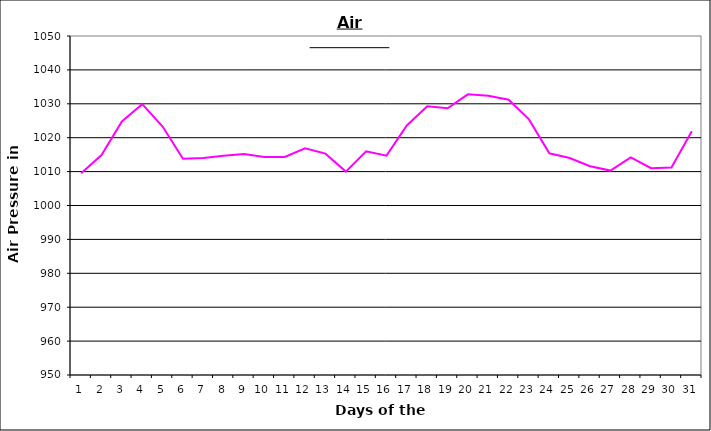
| Category | Series 0 |
|---|---|
| 0 | 1009.5 |
| 1 | 1014.9 |
| 2 | 1024.8 |
| 3 | 1029.9 |
| 4 | 1023.3 |
| 5 | 1013.8 |
| 6 | 1014 |
| 7 | 1014.7 |
| 8 | 1015.2 |
| 9 | 1014.3 |
| 10 | 1014.3 |
| 11 | 1016.9 |
| 12 | 1015.3 |
| 13 | 1010 |
| 14 | 1016 |
| 15 | 1014.7 |
| 16 | 1023.6 |
| 17 | 1029.3 |
| 18 | 1028.7 |
| 19 | 1032.8 |
| 20 | 1032.4 |
| 21 | 1031.2 |
| 22 | 1025.4 |
| 23 | 1015.4 |
| 24 | 1014 |
| 25 | 1011.6 |
| 26 | 1010.3 |
| 27 | 1014.2 |
| 28 | 1011 |
| 29 | 1011.2 |
| 30 | 1021.9 |